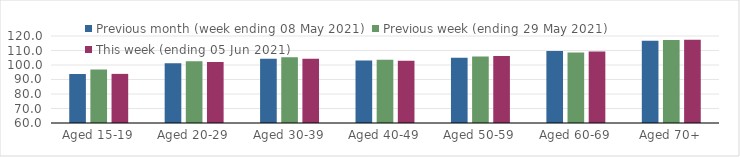
| Category | Previous month (week ending 08 May 2021) | Previous week (ending 29 May 2021) | This week (ending 05 Jun 2021) |
|---|---|---|---|
| Aged 15-19 | 93.78 | 96.92 | 93.88 |
| Aged 20-29 | 101.24 | 102.58 | 102.02 |
| Aged 30-39 | 104.24 | 105.35 | 104.34 |
| Aged 40-49 | 103.03 | 103.6 | 102.97 |
| Aged 50-59 | 105.04 | 105.82 | 106.14 |
| Aged 60-69 | 109.68 | 108.56 | 109.39 |
| Aged 70+ | 116.66 | 117.22 | 117.41 |